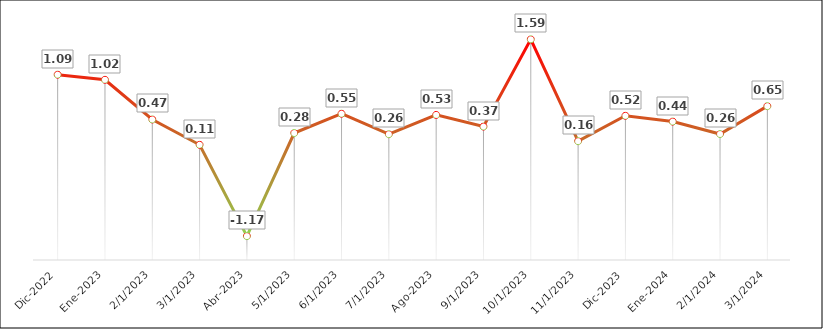
| Category | Inflación |
|---|---|
| Dic-2022 | 1.095 |
| Ene-2023 | 1.023 |
| Feb-2023 | 0.467 |
| Mar-2023 | 0.113 |
| Abr-2023 | -1.166 |
| May-2023 | 0.278 |
| Jun-2023 | 0.548 |
| Jul-2023 | 0.261 |
| Ago-2023 | 0.531 |
| Sep-2023 | 0.368 |
| Oct-2023 | 1.59 |
| Nov-2023 | 0.164 |
| Dic-2023 | 0.519 |
| Ene-2024 | 0.438 |
| Feb-2024 | 0.264 |
| Mar-2024 | 0.654 |